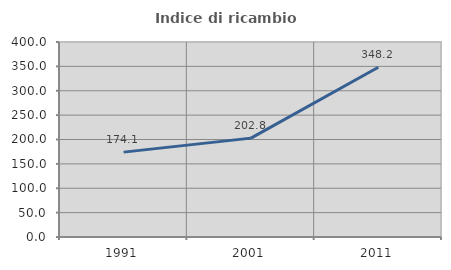
| Category | Indice di ricambio occupazionale  |
|---|---|
| 1991.0 | 174.121 |
| 2001.0 | 202.827 |
| 2011.0 | 348.168 |